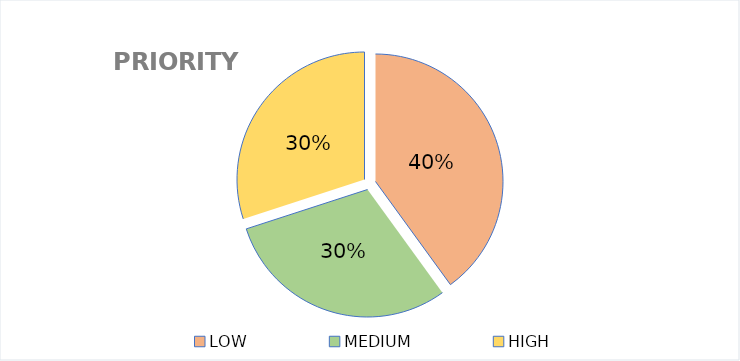
| Category | Series 0 |
|---|---|
| LOW | 4 |
| MEDIUM | 3 |
| HIGH | 3 |